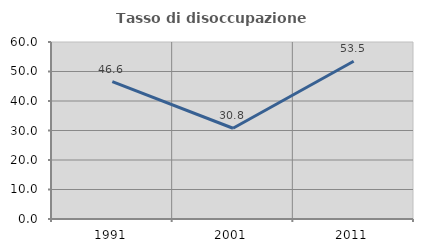
| Category | Tasso di disoccupazione giovanile  |
|---|---|
| 1991.0 | 46.602 |
| 2001.0 | 30.769 |
| 2011.0 | 53.488 |